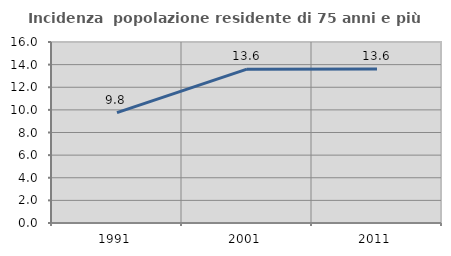
| Category | Incidenza  popolazione residente di 75 anni e più |
|---|---|
| 1991.0 | 9.754 |
| 2001.0 | 13.596 |
| 2011.0 | 13.615 |